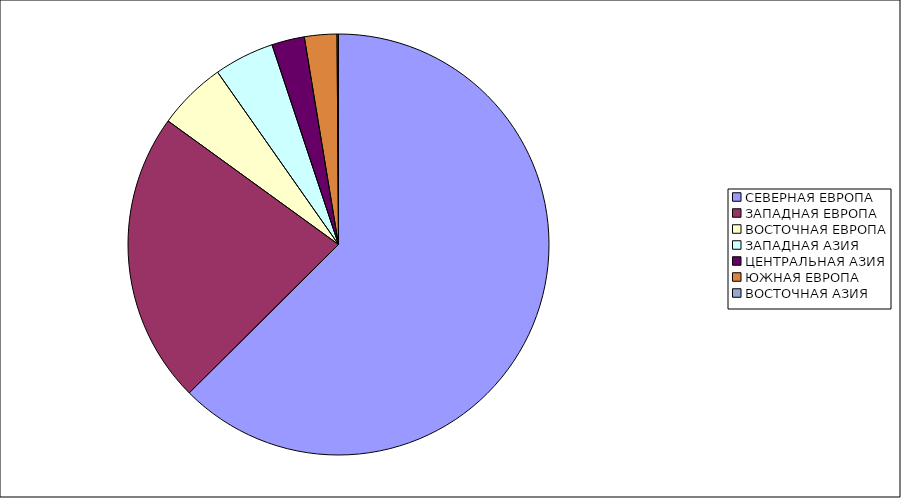
| Category | Оборот |
|---|---|
| СЕВЕРНАЯ ЕВРОПА | 62.548 |
| ЗАПАДНАЯ ЕВРОПА | 22.434 |
| ВОСТОЧНАЯ ЕВРОПА | 5.281 |
| ЗАПАДНАЯ АЗИЯ | 4.624 |
| ЦЕНТРАЛЬНАЯ АЗИЯ | 2.51 |
| ЮЖНАЯ ЕВРОПА | 2.493 |
| ВОСТОЧНАЯ АЗИЯ | 0.111 |